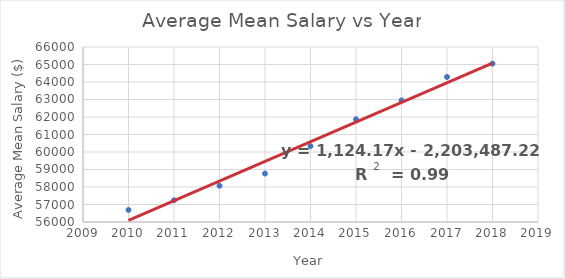
| Category | Year vs Average Mean Salary |
|---|---|
| 2010.0 | 56690 |
| 2011.0 | 57240 |
| 2012.0 | 58070 |
| 2013.0 | 58770 |
| 2014.0 | 60330 |
| 2015.0 | 61870 |
| 2016.0 | 62950 |
| 2017.0 | 64290 |
| 2018.0 | 65050 |